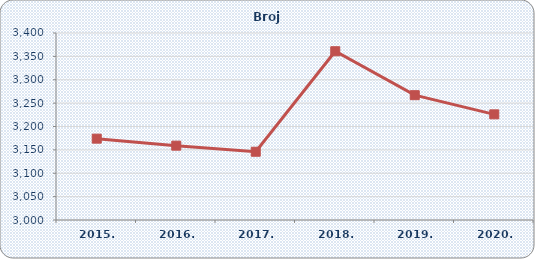
| Category | Broj zaposlenih |
|---|---|
| 2015. | 3174 |
| 2016. | 3159 |
| 2017. | 3146 |
| 2018. | 3361 |
| 2019. | 3267 |
| 2020. | 3226 |